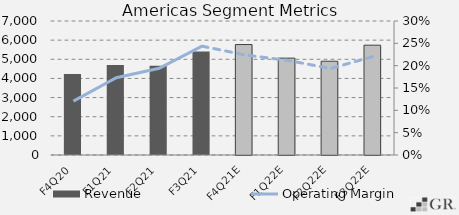
| Category | Revenue |
|---|---|
|  F4Q20  | 4232.9 |
|  F1Q21  | 4703.2 |
|  F2Q21  | 4664.6 |
|  F3Q21  | 5400.3 |
|  F4Q21E  | 5770.442 |
|  F1Q22E  | 5060.265 |
|  F2Q22E  | 4898.461 |
|  F3Q22E  | 5736.627 |